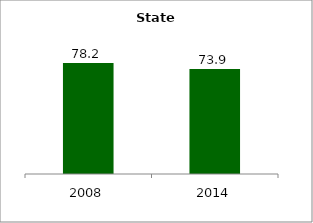
| Category | State |
|---|---|
| 2008.0 | 78.155 |
| 2014.0 | 73.912 |